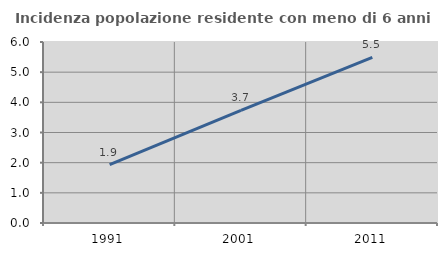
| Category | Incidenza popolazione residente con meno di 6 anni |
|---|---|
| 1991.0 | 1.938 |
| 2001.0 | 3.733 |
| 2011.0 | 5.492 |